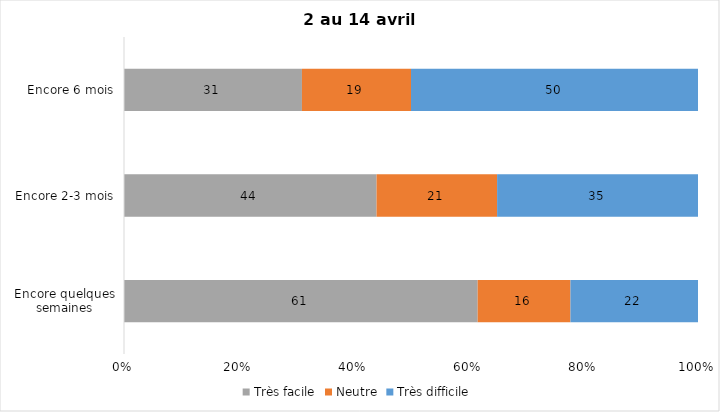
| Category | Très facile | Neutre | Très difficile |
|---|---|---|---|
| Encore quelques semaines | 61 | 16 | 22 |
| Encore 2-3 mois | 44 | 21 | 35 |
| Encore 6 mois | 31 | 19 | 50 |